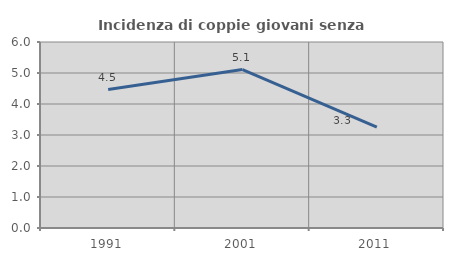
| Category | Incidenza di coppie giovani senza figli |
|---|---|
| 1991.0 | 4.467 |
| 2001.0 | 5.112 |
| 2011.0 | 3.257 |